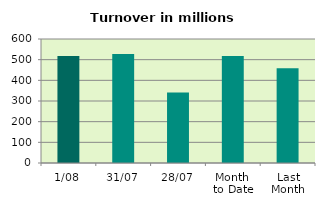
| Category | Series 0 |
|---|---|
| 1/08 | 517.328 |
| 31/07 | 526.851 |
| 28/07 | 340.758 |
| Month 
to Date | 517.328 |
| Last
Month | 459.043 |